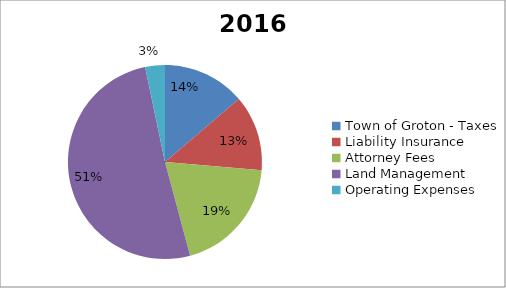
| Category | 2016 |
|---|---|
| Town of Groton - Taxes | 0.138 |
| Liability Insurance | 0.126 |
| Attorney Fees | 0.195 |
| Land Management  | 0.509 |
| Operating Expenses | 0.033 |